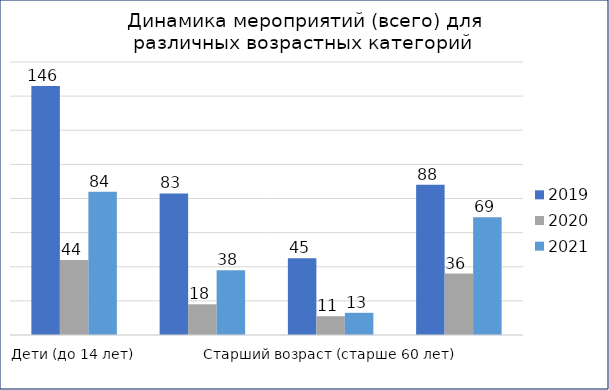
| Category | 2019 | 2020 | 2021 |
|---|---|---|---|
| Дети (до 14 лет) | 146 | 44 | 84 |
| Молодой возраст (14-35 лет) | 83 | 18 | 38 |
| Старший возраст (старше 60 лет) | 45 | 11 | 13 |
| Смешанный возраст (для любого возраста) | 88 | 36 | 69 |